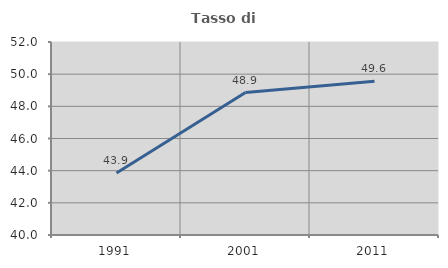
| Category | Tasso di occupazione   |
|---|---|
| 1991.0 | 43.851 |
| 2001.0 | 48.857 |
| 2011.0 | 49.558 |